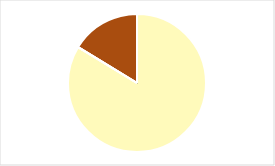
| Category | Series 0 |
|---|---|
| 0 | 0 |
| 1 | 0.837 |
| 2 | 0 |
| 3 | 0 |
| 4 | 0.163 |